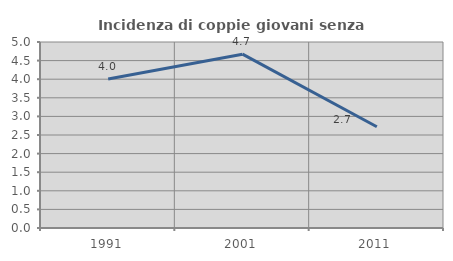
| Category | Incidenza di coppie giovani senza figli |
|---|---|
| 1991.0 | 4.005 |
| 2001.0 | 4.673 |
| 2011.0 | 2.723 |